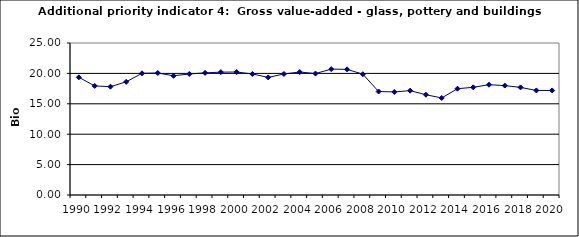
| Category | Gross value-added - glass, pottery and buildings materials industry, Bio Euro (EC95) |
|---|---|
| 1990 | 19.358 |
| 1991 | 17.943 |
| 1992 | 17.819 |
| 1993 | 18.615 |
| 1994 | 20.013 |
| 1995 | 20.066 |
| 1996 | 19.606 |
| 1997 | 19.907 |
| 1998 | 20.084 |
| 1999 | 20.208 |
| 2000 | 20.225 |
| 2001 | 19.907 |
| 2002 | 19.341 |
| 2003 | 19.907 |
| 2004 | 20.225 |
| 2005 | 19.978 |
| 2006 | 20.703 |
| 2007 | 20.668 |
| 2008 | 19.872 |
| 2009 | 17.023 |
| 2010 | 16.952 |
| 2011 | 17.164 |
| 2012 | 16.492 |
| 2013 | 15.961 |
| 2014 | 17.483 |
| 2015 | 17.713 |
| 2016 | 18.137 |
| 2017 | 17.996 |
| 2018 | 17.695 |
| 2019 | 17.2 |
| 2020 | 17.2 |